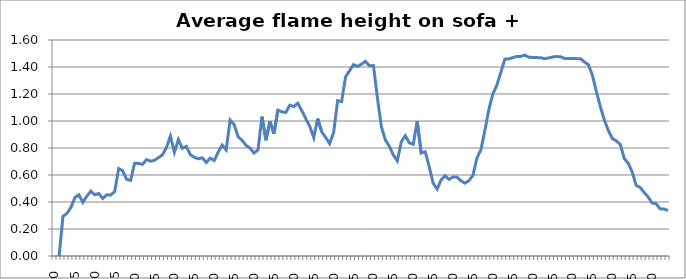
| Category | m |
|---|---|
| 0.0 | -0.01 |
| 5.0 | -0.01 |
| 10.0 | 0.294 |
| 15.0 | 0.315 |
| 20.0 | 0.36 |
| 25.0 | 0.433 |
| 30.0 | 0.454 |
| 35.0 | 0.397 |
| 40.0 | 0.443 |
| 45.0 | 0.481 |
| 50.0 | 0.453 |
| 55.0 | 0.463 |
| 60.0 | 0.426 |
| 65.0 | 0.453 |
| 70.0 | 0.452 |
| 75.0 | 0.477 |
| 80.0 | 0.648 |
| 85.0 | 0.632 |
| 90.0 | 0.567 |
| 95.0 | 0.561 |
| 100.0 | 0.687 |
| 105.0 | 0.685 |
| 110.0 | 0.679 |
| 115.0 | 0.714 |
| 120.0 | 0.702 |
| 125.0 | 0.709 |
| 130.0 | 0.729 |
| 135.0 | 0.75 |
| 140.0 | 0.803 |
| 145.0 | 0.889 |
| 150.0 | 0.769 |
| 155.0 | 0.863 |
| 160.0 | 0.797 |
| 165.0 | 0.812 |
| 170.0 | 0.75 |
| 175.0 | 0.731 |
| 180.0 | 0.72 |
| 185.0 | 0.728 |
| 190.0 | 0.693 |
| 195.0 | 0.725 |
| 200.0 | 0.707 |
| 205.0 | 0.769 |
| 210.0 | 0.822 |
| 215.0 | 0.786 |
| 220.0 | 1.007 |
| 225.0 | 0.974 |
| 230.0 | 0.883 |
| 235.0 | 0.858 |
| 240.0 | 0.819 |
| 245.0 | 0.8 |
| 250.0 | 0.762 |
| 255.0 | 0.786 |
| 260.0 | 1.032 |
| 265.0 | 0.857 |
| 270.0 | 0.998 |
| 275.0 | 0.906 |
| 280.0 | 1.081 |
| 285.0 | 1.068 |
| 290.0 | 1.063 |
| 295.0 | 1.117 |
| 300.0 | 1.107 |
| 305.0 | 1.132 |
| 310.0 | 1.076 |
| 315.0 | 1.017 |
| 320.0 | 0.961 |
| 325.0 | 0.877 |
| 330.0 | 1.018 |
| 335.0 | 0.92 |
| 340.0 | 0.878 |
| 345.0 | 0.832 |
| 350.0 | 0.915 |
| 355.0 | 1.151 |
| 360.0 | 1.144 |
| 365.0 | 1.327 |
| 370.0 | 1.372 |
| 375.0 | 1.417 |
| 380.0 | 1.404 |
| 385.0 | 1.421 |
| 390.0 | 1.442 |
| 395.0 | 1.408 |
| 400.0 | 1.411 |
| 405.0 | 1.171 |
| 410.0 | 0.956 |
| 415.0 | 0.859 |
| 420.0 | 0.812 |
| 425.0 | 0.748 |
| 430.0 | 0.704 |
| 435.0 | 0.846 |
| 440.0 | 0.892 |
| 445.0 | 0.838 |
| 450.0 | 0.827 |
| 455.0 | 0.999 |
| 460.0 | 0.762 |
| 465.0 | 0.771 |
| 470.0 | 0.663 |
| 475.0 | 0.539 |
| 480.0 | 0.495 |
| 485.0 | 0.564 |
| 490.0 | 0.595 |
| 495.0 | 0.567 |
| 500.0 | 0.586 |
| 505.0 | 0.584 |
| 510.0 | 0.557 |
| 515.0 | 0.54 |
| 520.0 | 0.559 |
| 525.0 | 0.598 |
| 530.0 | 0.726 |
| 535.0 | 0.788 |
| 540.0 | 0.93 |
| 545.0 | 1.086 |
| 550.0 | 1.202 |
| 555.0 | 1.264 |
| 560.0 | 1.36 |
| 565.0 | 1.458 |
| 570.0 | 1.46 |
| 575.0 | 1.469 |
| 580.0 | 1.478 |
| 585.0 | 1.479 |
| 590.0 | 1.489 |
| 595.0 | 1.472 |
| 600.0 | 1.471 |
| 605.0 | 1.47 |
| 610.0 | 1.468 |
| 615.0 | 1.462 |
| 620.0 | 1.467 |
| 625.0 | 1.474 |
| 630.0 | 1.478 |
| 635.0 | 1.476 |
| 640.0 | 1.464 |
| 645.0 | 1.462 |
| 650.0 | 1.464 |
| 655.0 | 1.462 |
| 660.0 | 1.462 |
| 665.0 | 1.437 |
| 670.0 | 1.417 |
| 675.0 | 1.339 |
| 680.0 | 1.218 |
| 685.0 | 1.107 |
| 690.0 | 1.008 |
| 695.0 | 0.93 |
| 700.0 | 0.87 |
| 705.0 | 0.853 |
| 710.0 | 0.827 |
| 715.0 | 0.724 |
| 720.0 | 0.687 |
| 725.0 | 0.623 |
| 730.0 | 0.523 |
| 735.0 | 0.508 |
| 740.0 | 0.471 |
| 745.0 | 0.437 |
| 750.0 | 0.393 |
| 755.0 | 0.387 |
| 760.0 | 0.35 |
| 765.0 | 0.348 |
| 770.0 | 0.337 |